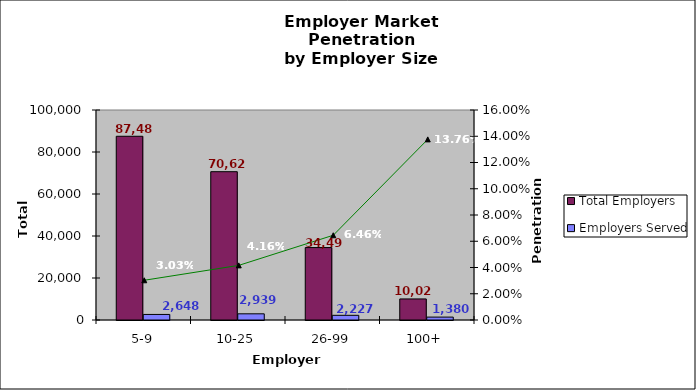
| Category | Total Employers | Employers Served |
|---|---|---|
| 5-9 | 87489 | 2648 |
| 10-25 | 70625 | 2939 |
| 26-99 | 34491 | 2227 |
| 100+ | 10028 | 1380 |